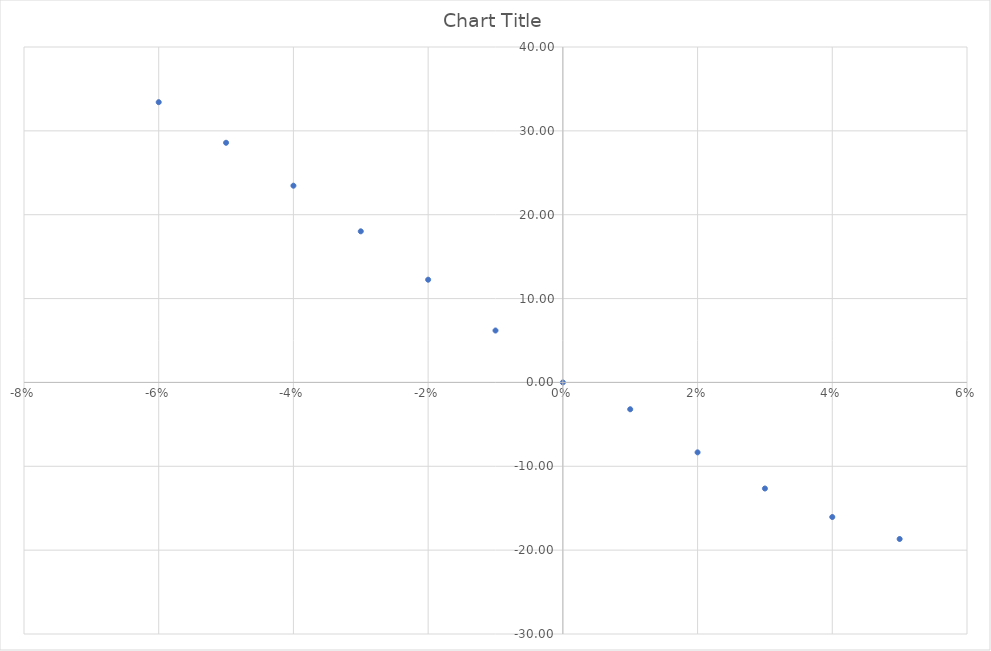
| Category | Series 0 |
|---|---|
| -0.06 | 33.42 |
| -0.05 | 28.58 |
| -0.04 | 23.46 |
| -0.03 | 18.02 |
| -0.02 | 12.25 |
| -0.01 | 6.19 |
| 0.0 | 0 |
| 0.01 | -3.2 |
| 0.02 | -8.34 |
| 0.03 | -12.65 |
| 0.04 | -16.05 |
| 0.05 | -18.67 |